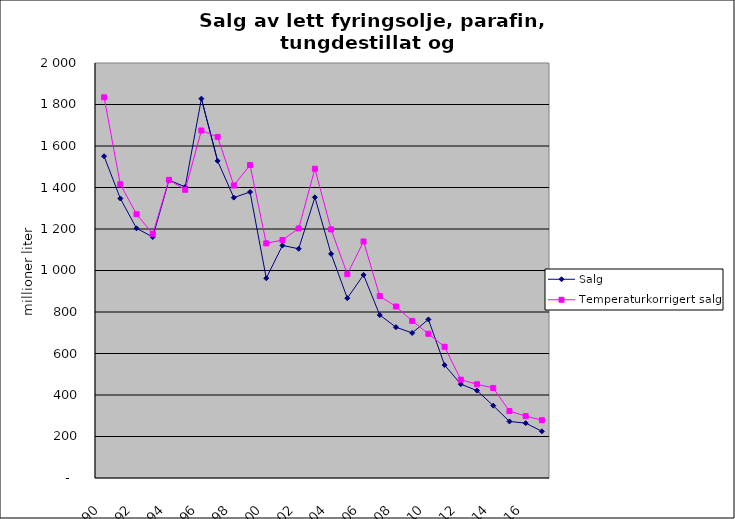
| Category | Salg | Temperaturkorrigert salg |
|---|---|---|
| 90 | 1550.52 | 1834.733 |
| 91 | 1347.03 | 1415.778 |
| 92 | 1203.273 | 1271.379 |
| 93 | 1161.311 | 1176.79 |
| 94 | 1435.543 | 1436.93 |
| 95 | 1402.989 | 1388.93 |
| 96 | 1828.188 | 1674.628 |
| 97 | 1528.386 | 1643.897 |
| 98 | 1351.137 | 1409.799 |
| 99 | 1378.262 | 1508.148 |
| 00 | 962.772 | 1130.86 |
| 01 | 1120.619 | 1146.839 |
| 02 | 1104.756 | 1202.646 |
| 03 | 1352.578 | 1490.341 |
| 04 | 1080.08 | 1198.247 |
| 05 | 866.665 | 981.968 |
| 06 | 978.708 | 1139.923 |
| 07 | 785.333 | 876.526 |
| 08 | 726.768 | 826.48 |
| 09 | 699.004 | 757.021 |
| 10 | 764.313 | 695.066 |
| 11 | 544.214 | 632.322 |
| 12 | 452.2 | 473.77 |
| 13 | 421.08 | 451.608 |
| 14 | 348.603 | 433.941 |
| 15 | 272.468 | 322.441 |
| 16 | 264.451 | 298.036 |
| 17 | 224.992 | 278.54 |